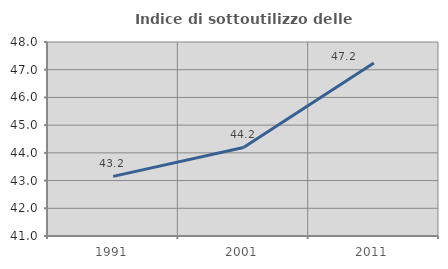
| Category | Indice di sottoutilizzo delle abitazioni  |
|---|---|
| 1991.0 | 43.152 |
| 2001.0 | 44.194 |
| 2011.0 | 47.239 |